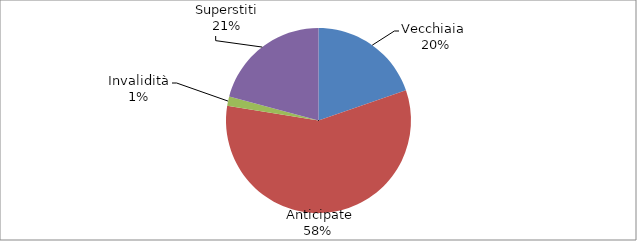
| Category | Series 0 |
|---|---|
| Vecchiaia  | 29591 |
|  Anticipate | 86754 |
| Invalidità | 2490 |
| Superstiti | 31218 |